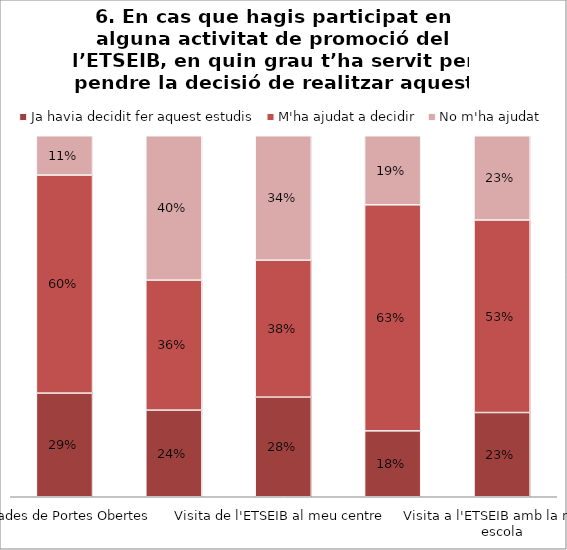
| Category | Ja havia decidit fer aquest estudis | M'ha ajudat a decidir | No m'ha ajudat |
|---|---|---|---|
| Jornades de Portes Obertes | 0.287 | 0.604 | 0.109 |
| Activitats de Difusió (tallers) | 0.24 | 0.36 | 0.4 |
| Visita de l'ETSEIB al meu centre | 0.276 | 0.379 | 0.345 |
| Saló de l'Ensenyament | 0.183 | 0.626 | 0.191 |
| Visita a l'ETSEIB amb la meva escola | 0.233 | 0.533 | 0.233 |